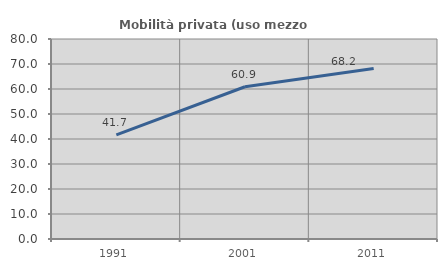
| Category | Mobilità privata (uso mezzo privato) |
|---|---|
| 1991.0 | 41.688 |
| 2001.0 | 60.891 |
| 2011.0 | 68.163 |